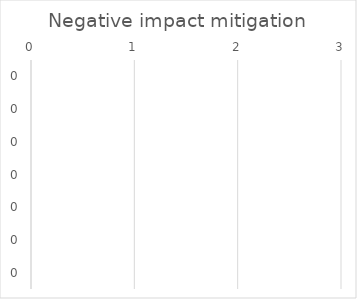
| Category | Negative impact mitigation |
|---|---|
| 0.0 | 0 |
| 0.0 | 0 |
| 0.0 | 0 |
| 0.0 | 0 |
| 0.0 | 0 |
| 0.0 | 0 |
| 0.0 | 0 |